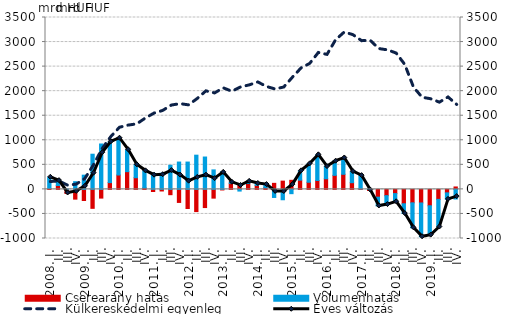
| Category | Cserearány hatás | Volumenhatás |
|---|---|---|
| 2008. I. | 17.716 | 228.857 |
|          II. | 78.837 | 99.435 |
|          III. | -83.135 | 10.012 |
|          IV. | -198.378 | 157.109 |
| 2009. I. | -226.518 | 289.364 |
|          II. | -385.789 | 716.286 |
|          III. | -177.268 | 924.358 |
|          IV. | 138.262 | 831.389 |
| 2010. I. | 293.093 | 748.868 |
|          II. | 361.005 | 445.904 |
|          III. | 237.755 | 263.367 |
|          IV. | 30.37 | 347.355 |
| 2011. I. | -43.552 | 332.72 |
|          II. | -32.16 | 330.976 |
|          III. | -107.92 | 491.3 |
|          IV. | -265.49 | 556.711 |
| 2012. I. | -389.723 | 556.504 |
|          II. | -451.989 | 696.559 |
|          III. | -369.98 | 659.004 |
|          IV. | -178.054 | 396.695 |
| 2013. I. | -11.4 | 358.097 |
|          II. | 123.099 | 21.412 |
|          III. | 113.67 | -34.303 |
|          IV. | 119.201 | 44.424 |
| 2014. I. | 82.454 | 36.964 |
|          II. | 35.068 | 62.922 |
|          III. | 122.916 | -164.327 |
|          IV. | 168.094 | -211.056 |
| 2015. I. | 184.353 | -87.148 |
|          II. | 187.981 | 189.922 |
|          III. | 145.076 | 375.866 |
|          IV. | 180.905 | 522.742 |
| 2016. I. | 216.598 | 247.521 |
|          II. | 285.797 | 288.249 |
|          III. | 307.369 | 332.29 |
|          IV. | 136.451 | 225.289 |
| 2017. I. | 10.524 | 269.6 |
|          II. | -22.476 | 10.207 |
|          III. | -158.413 | -179.37 |
|          IV. | -127.805 | -181.749 |
| 2018. I. | -85.74 | -166.184 |
|          II. | -292.904 | -199.512 |
|          III. | -273.733 | -509.261 |
|          IV. | -276.383 | -688.318 |
| 2019. I. | -333.754 | -597.431 |
|          II. | -203.115 | -563.63 |
|          III. | -70.638 | -131.961 |
|          IV. | 49.25 | -195.527 |